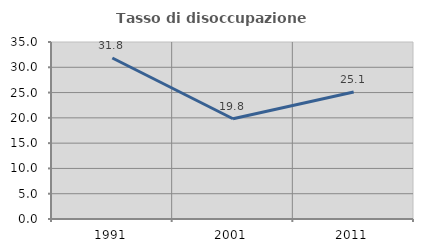
| Category | Tasso di disoccupazione giovanile  |
|---|---|
| 1991.0 | 31.832 |
| 2001.0 | 19.825 |
| 2011.0 | 25.11 |